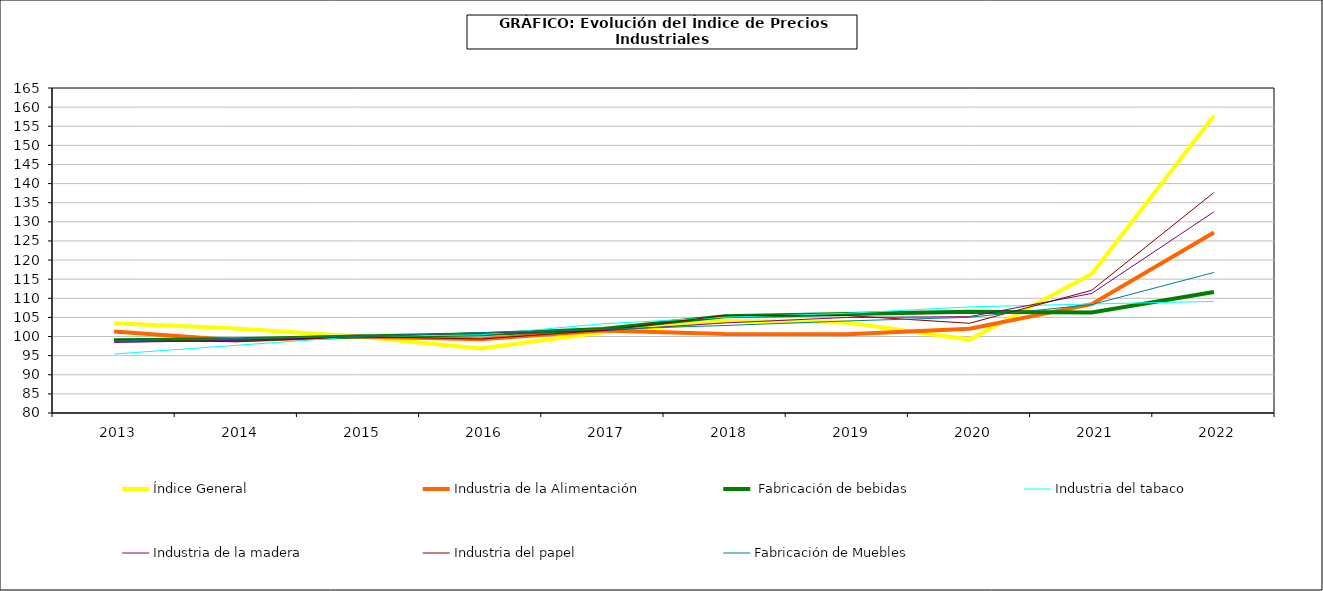
| Category | Índice General | Industria de la Alimentación |  Fabricación de bebidas | Industria del tabaco | Industria de la madera  | Industria del papel | Fabricación de Muebles |
|---|---|---|---|---|---|---|---|
|    2013 | 103.496 | 101.306 | 99.026 | 95.432 | 98.444 | 99.086 | 98.846 |
|    2014 | 102.112 | 99.053 | 99.281 | 97.706 | 98.997 | 98.623 | 99.459 |
|    2015 | 100 | 100 | 100 | 100 | 100 | 100 | 100 |
|    2016 | 96.869 | 99.296 | 100.581 | 100.444 | 100.967 | 99.346 | 101.015 |
|    2017 | 101.09 | 101.557 | 101.982 | 103.33 | 101.53 | 101.611 | 101.884 |
|    2018 | 104.1 | 100.647 | 105.281 | 105.049 | 103.567 | 105.498 | 102.886 |
|    2019 | 103.645 | 100.612 | 105.889 | 106.081 | 104.991 | 105.472 | 104.077 |
|    2020 | 99.202 | 102.059 | 106.476 | 107.759 | 105.199 | 103.468 | 105.038 |
|    2021 | 116.357 | 108.46 | 106.309 | 108.514 | 111.274 | 112.096 | 108.351 |
|    2022 | 157.722 | 127.208 | 111.636 | 109.19 | 132.604 | 137.661 | 116.758 |